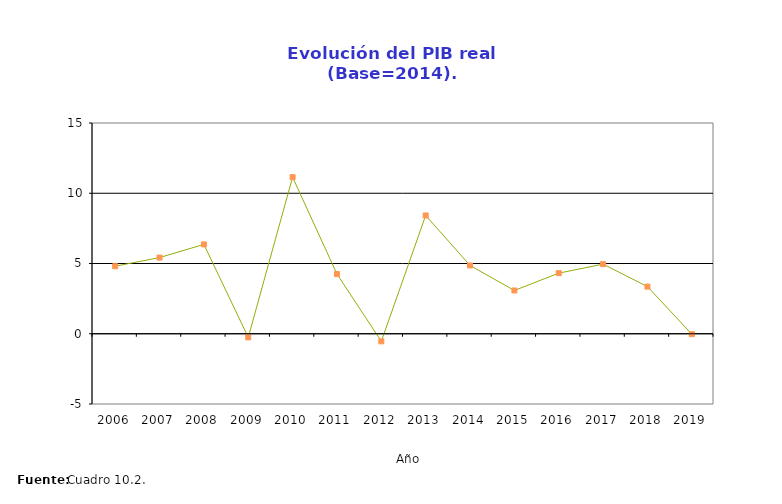
| Category | Evolución PIB real |
|---|---|
| 2006.0 | 4.807 |
| 2007.0 | 5.422 |
| 2008.0 | 6.359 |
| 2009.0 | -0.258 |
| 2010.0 | 11.144 |
| 2011.0 | 4.249 |
| 2012.0 | -0.539 |
| 2013.0 | 8.417 |
| 2014.0 | 4.861 |
| 2015.0 | 3.08 |
| 2016.0 | 4.313 |
| 2017.0 | 4.954 |
| 2018.0 | 3.356 |
| 2019.0 | -0.03 |